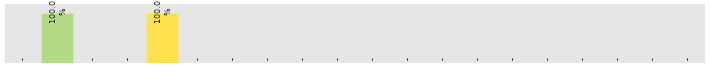
| Category | Thursday |
|---|---|
| Accounts | 0 |
| HR | 1 |
| Lobby/Reception | 0 |
| Administration | 0 |
| Customer Support | 1 |
| Finance | 0 |
| Human Resources | 0 |
| IT | 0 |
| Marketing | 0 |
| R&D | 0 |
| Sales | 0 |